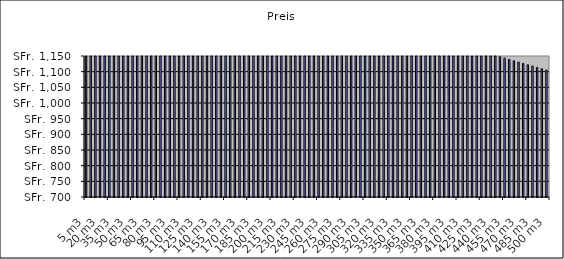
| Category | Preis |
|---|---|
| 5.0 | 1691.5 |
| 10.0 | 1683 |
| 15.0 | 1674.5 |
| 20.0 | 1666 |
| 25.0 | 1657.5 |
| 30.0 | 1649 |
| 35.0 | 1640.5 |
| 40.0 | 1632 |
| 45.0 | 1623.5 |
| 50.0 | 1615 |
| 55.0 | 1606.5 |
| 60.0 | 1598 |
| 65.0 | 1589.5 |
| 70.0 | 1581 |
| 75.0 | 1572.5 |
| 80.0 | 1564 |
| 85.0 | 1555.5 |
| 90.0 | 1547 |
| 95.0 | 1538.5 |
| 100.0 | 1530 |
| 105.0 | 1521.5 |
| 110.0 | 1513 |
| 115.0 | 1504.5 |
| 120.0 | 1496 |
| 125.0 | 1487.5 |
| 130.0 | 1479 |
| 135.0 | 1470.5 |
| 140.0 | 1462 |
| 145.0 | 1453.5 |
| 150.0 | 1445 |
| 155.0 | 1436.5 |
| 160.0 | 1428 |
| 165.0 | 1419.5 |
| 170.0 | 1411 |
| 175.0 | 1402.5 |
| 180.0 | 1394 |
| 185.0 | 1385.5 |
| 190.0 | 1377 |
| 195.0 | 1368.5 |
| 200.0 | 1360 |
| 205.0 | 1355.75 |
| 210.0 | 1351.5 |
| 215.0 | 1347.25 |
| 220.0 | 1343 |
| 225.0 | 1338.75 |
| 230.0 | 1334.5 |
| 235.0 | 1330.25 |
| 240.0 | 1326 |
| 245.0 | 1321.75 |
| 250.0 | 1317.5 |
| 255.0 | 1313.25 |
| 260.0 | 1309 |
| 265.0 | 1304.75 |
| 270.0 | 1300.5 |
| 275.0 | 1296.25 |
| 280.0 | 1292 |
| 285.0 | 1287.75 |
| 290.0 | 1283.5 |
| 295.0 | 1279.25 |
| 300.0 | 1275 |
| 305.0 | 1270.75 |
| 310.0 | 1266.5 |
| 315.0 | 1262.25 |
| 320.0 | 1258 |
| 325.0 | 1253.75 |
| 330.0 | 1249.5 |
| 335.0 | 1245.25 |
| 340.0 | 1241 |
| 345.0 | 1236.75 |
| 350.0 | 1232.5 |
| 355.0 | 1228.25 |
| 360.0 | 1224 |
| 365.0 | 1219.75 |
| 370.0 | 1215.5 |
| 375.0 | 1211.25 |
| 380.0 | 1207 |
| 385.0 | 1202.75 |
| 390.0 | 1198.5 |
| 395.0 | 1194.25 |
| 400.0 | 1190 |
| 405.0 | 1185.75 |
| 410.0 | 1181.5 |
| 415.0 | 1177.25 |
| 420.0 | 1173 |
| 425.0 | 1168.75 |
| 430.0 | 1164.5 |
| 435.0 | 1160.25 |
| 440.0 | 1156 |
| 445.0 | 1151.75 |
| 450.0 | 1147.5 |
| 455.0 | 1143.25 |
| 460.0 | 1139 |
| 465.0 | 1134.75 |
| 470.0 | 1130.5 |
| 475.0 | 1126.25 |
| 480.0 | 1122 |
| 485.0 | 1117.75 |
| 490.0 | 1113.5 |
| 495.0 | 1109.25 |
| 500.0 | 1105 |